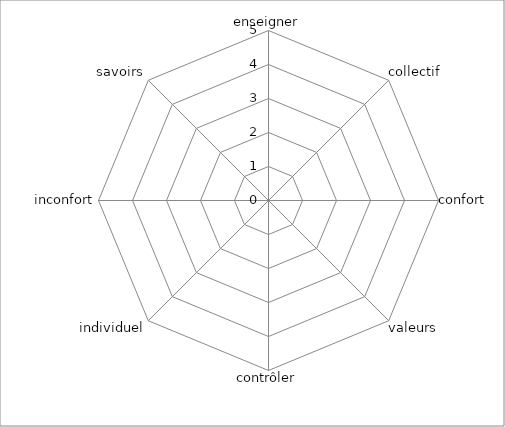
| Category | Series 0 |
|---|---|
| enseigner | 0 |
| collectif | 0 |
| confort | 0 |
| valeurs | 0 |
| contrôler | 0 |
| individuel | 0 |
| inconfort | 0 |
| savoirs | 0 |